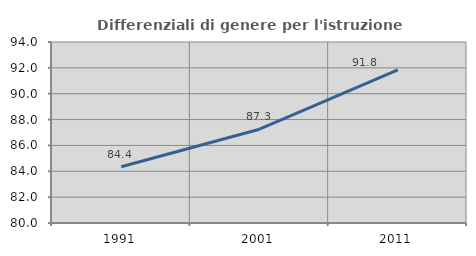
| Category | Differenziali di genere per l'istruzione superiore |
|---|---|
| 1991.0 | 84.355 |
| 2001.0 | 87.255 |
| 2011.0 | 91.843 |